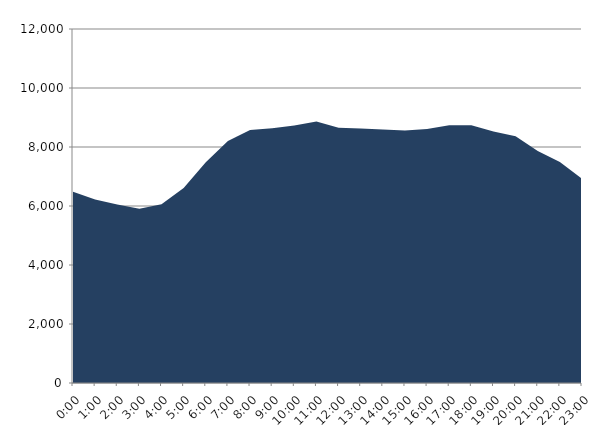
| Category | Series 0 | Series 1 |
|---|---|---|
| 2022-08-17 |  | 6485.667 |
| 2022-08-17 01:00:00 |  | 6223.083 |
| 2022-08-17 02:00:00 |  | 6048.111 |
| 2022-08-17 03:00:00 |  | 5908.713 |
| 2022-08-17 04:00:00 |  | 6061.966 |
| 2022-08-17 05:00:00 |  | 6608.362 |
| 2022-08-17 06:00:00 |  | 7479.258 |
| 2022-08-17 07:00:00 |  | 8207.281 |
| 2022-08-17 08:00:00 |  | 8573.541 |
| 2022-08-17 09:00:00 |  | 8633.939 |
| 2022-08-17 10:00:00 |  | 8731.075 |
| 2022-08-17 11:00:00 |  | 8861.655 |
| 2022-08-17 12:00:00 |  | 8654.74 |
| 2022-08-17 13:00:00 |  | 8631.311 |
| 2022-08-17 14:00:00 |  | 8592.176 |
| 2022-08-17 15:00:00 |  | 8555.126 |
| 2022-08-17 16:00:00 |  | 8610.82 |
| 2022-08-17 17:00:00 |  | 8735.365 |
| 2022-08-17 18:00:00 |  | 8734.307 |
| 2022-08-17 19:00:00 |  | 8527.861 |
| 2022-08-17 20:00:00 |  | 8360.345 |
| 2022-08-17 21:00:00 |  | 7866.101 |
| 2022-08-17 22:00:00 |  | 7495.034 |
| 2022-08-17 23:00:00 |  | 6923.565 |